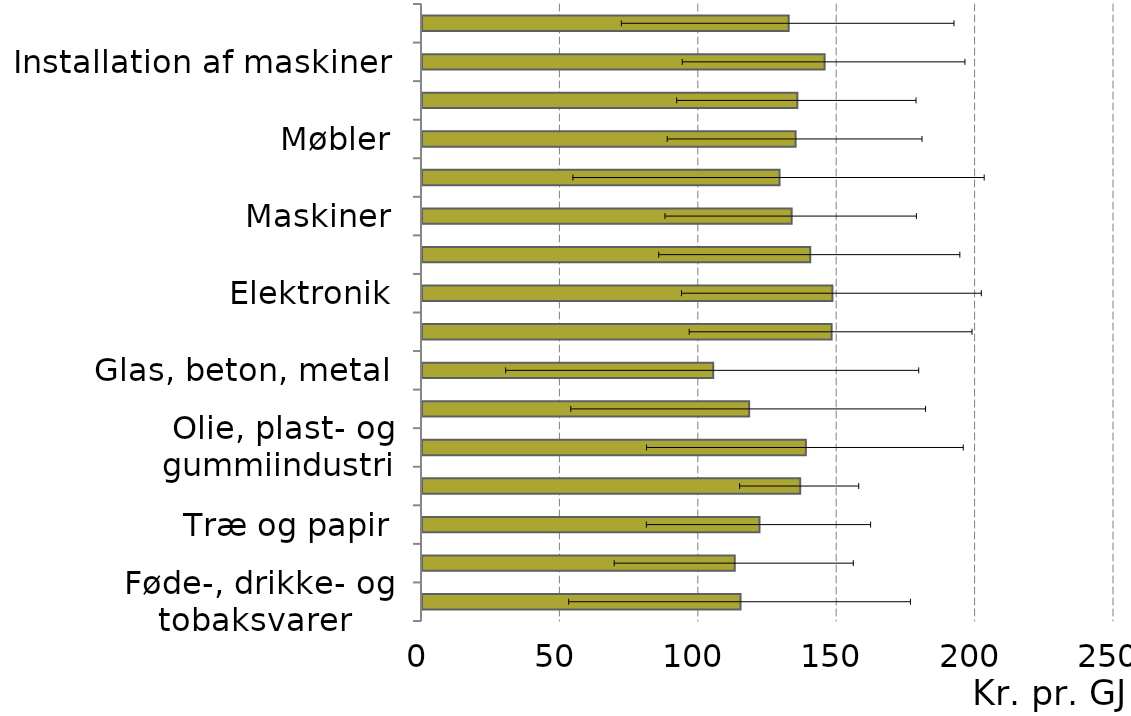
| Category | Middel |
|---|---|
|  Føde-, drikke- og tobaksvarer | 115.082 |
|  Tekstil og læder | 112.984 |
|  Træ og papir | 121.928 |
|  Trykkerier | 136.629 |
|  Olie, plast- og gummiindustri | 138.679 |
|  Kemi og medicin | 118.191 |
|  Glas, beton, metal | 105.198 |
|  Metalvarer | 147.98 |
|  Elektronik | 148.268 |
|  Elektrisk udstyr | 140.267 |
|  Maskiner | 133.554 |
|  Transportmidler | 129.166 |
|  Møbler | 134.975 |
|  Anden industri | 135.605 |
|  Installation af maskiner | 145.45 |
|  I alt | 132.469 |